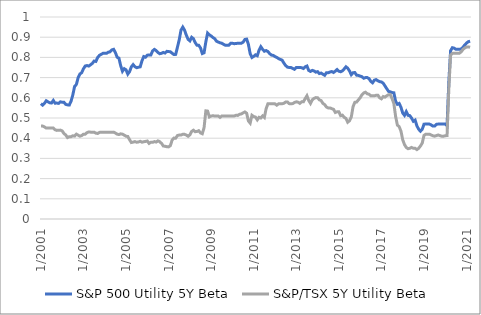
| Category | S&P 500 Utility 5Y Beta | S&P/TSX 5Y Utility Beta |
|---|---|---|
| 2001-01-31 | 0.571 | 0.46 |
| 2001-02-28 | 0.564 | 0.46 |
| 2001-03-31 | 0.572 | 0.456 |
| 2001-04-30 | 0.585 | 0.45 |
| 2001-05-31 | 0.58 | 0.45 |
| 2001-06-30 | 0.575 | 0.45 |
| 2001-07-31 | 0.574 | 0.45 |
| 2001-08-30 | 0.587 | 0.45 |
| 2001-09-30 | 0.573 | 0.442 |
| 2001-10-31 | 0.574 | 0.439 |
| 2001-11-30 | 0.572 | 0.44 |
| 2001-12-31 | 0.58 | 0.44 |
| 2002-01-31 | 0.578 | 0.436 |
| 2002-02-28 | 0.578 | 0.423 |
| 2002-03-31 | 0.568 | 0.416 |
| 2002-04-30 | 0.565 | 0.403 |
| 2002-05-31 | 0.564 | 0.408 |
| 2002-06-30 | 0.583 | 0.408 |
| 2002-07-31 | 0.614 | 0.412 |
| 2002-08-30 | 0.656 | 0.41 |
| 2002-09-30 | 0.666 | 0.42 |
| 2002-10-31 | 0.7 | 0.415 |
| 2002-11-30 | 0.718 | 0.41 |
| 2002-12-31 | 0.724 | 0.413 |
| 2003-01-31 | 0.744 | 0.42 |
| 2003-02-28 | 0.757 | 0.42 |
| 2003-03-31 | 0.76 | 0.428 |
| 2003-04-30 | 0.757 | 0.431 |
| 2003-05-31 | 0.763 | 0.43 |
| 2003-06-30 | 0.77 | 0.43 |
| 2003-07-31 | 0.782 | 0.43 |
| 2003-08-30 | 0.78 | 0.425 |
| 2003-09-30 | 0.8 | 0.423 |
| 2003-10-31 | 0.81 | 0.429 |
| 2003-11-30 | 0.815 | 0.43 |
| 2003-12-31 | 0.82 | 0.43 |
| 2004-01-31 | 0.82 | 0.43 |
| 2004-02-28 | 0.82 | 0.43 |
| 2004-03-31 | 0.826 | 0.43 |
| 2004-04-30 | 0.828 | 0.43 |
| 2004-05-31 | 0.837 | 0.429 |
| 2004-06-30 | 0.84 | 0.43 |
| 2004-07-31 | 0.824 | 0.426 |
| 2004-08-30 | 0.801 | 0.42 |
| 2004-09-30 | 0.796 | 0.418 |
| 2004-10-31 | 0.759 | 0.422 |
| 2004-11-30 | 0.731 | 0.42 |
| 2004-12-31 | 0.744 | 0.415 |
| 2005-01-31 | 0.739 | 0.41 |
| 2005-02-28 | 0.717 | 0.408 |
| 2005-03-31 | 0.73 | 0.393 |
| 2005-04-30 | 0.753 | 0.379 |
| 2005-05-31 | 0.764 | 0.38 |
| 2005-06-30 | 0.754 | 0.383 |
| 2005-07-31 | 0.749 | 0.38 |
| 2005-08-30 | 0.751 | 0.381 |
| 2005-09-30 | 0.753 | 0.385 |
| 2005-10-31 | 0.783 | 0.38 |
| 2005-11-30 | 0.804 | 0.382 |
| 2005-12-31 | 0.801 | 0.384 |
| 2006-01-31 | 0.811 | 0.386 |
| 2006-02-28 | 0.812 | 0.374 |
| 2006-03-31 | 0.812 | 0.38 |
| 2006-04-30 | 0.832 | 0.379 |
| 2006-05-31 | 0.84 | 0.383 |
| 2006-06-30 | 0.834 | 0.381 |
| 2006-07-31 | 0.825 | 0.387 |
| 2006-08-30 | 0.818 | 0.383 |
| 2006-09-30 | 0.82 | 0.375 |
| 2006-10-31 | 0.825 | 0.361 |
| 2006-11-30 | 0.821 | 0.36 |
| 2006-12-31 | 0.83 | 0.358 |
| 2007-01-31 | 0.829 | 0.357 |
| 2007-02-28 | 0.828 | 0.363 |
| 2007-03-31 | 0.821 | 0.391 |
| 2007-04-30 | 0.814 | 0.401 |
| 2007-05-31 | 0.815 | 0.4 |
| 2007-06-30 | 0.851 | 0.413 |
| 2007-07-31 | 0.887 | 0.416 |
| 2007-08-30 | 0.935 | 0.415 |
| 2007-09-30 | 0.95 | 0.419 |
| 2007-10-31 | 0.935 | 0.419 |
| 2007-11-30 | 0.91 | 0.416 |
| 2007-12-31 | 0.89 | 0.409 |
| 2008-01-31 | 0.882 | 0.417 |
| 2008-02-28 | 0.9 | 0.434 |
| 2008-03-31 | 0.893 | 0.44 |
| 2008-04-30 | 0.873 | 0.432 |
| 2008-05-31 | 0.86 | 0.433 |
| 2008-06-30 | 0.86 | 0.437 |
| 2008-07-31 | 0.847 | 0.426 |
| 2008-08-30 | 0.819 | 0.422 |
| 2008-09-30 | 0.823 | 0.452 |
| 2008-10-31 | 0.877 | 0.535 |
| 2008-11-30 | 0.921 | 0.534 |
| 2008-12-31 | 0.912 | 0.505 |
| 2009-01-31 | 0.906 | 0.51 |
| 2009-02-28 | 0.898 | 0.511 |
| 2009-03-31 | 0.893 | 0.51 |
| 2009-04-30 | 0.88 | 0.51 |
| 2009-05-31 | 0.876 | 0.51 |
| 2009-06-30 | 0.872 | 0.503 |
| 2009-07-31 | 0.87 | 0.51 |
| 2009-08-30 | 0.865 | 0.51 |
| 2009-09-30 | 0.86 | 0.51 |
| 2009-10-31 | 0.86 | 0.51 |
| 2009-11-30 | 0.86 | 0.51 |
| 2009-12-31 | 0.87 | 0.51 |
| 2010-01-31 | 0.87 | 0.51 |
| 2010-02-28 | 0.868 | 0.51 |
| 2010-03-31 | 0.869 | 0.513 |
| 2010-04-30 | 0.87 | 0.513 |
| 2010-05-31 | 0.87 | 0.518 |
| 2010-06-30 | 0.87 | 0.52 |
| 2010-07-31 | 0.875 | 0.525 |
| 2010-08-30 | 0.889 | 0.53 |
| 2010-09-30 | 0.89 | 0.524 |
| 2010-10-31 | 0.864 | 0.486 |
| 2010-11-30 | 0.819 | 0.475 |
| 2010-12-31 | 0.8 | 0.513 |
| 2011-01-31 | 0.805 | 0.507 |
| 2011-02-28 | 0.813 | 0.505 |
| 2011-03-31 | 0.808 | 0.491 |
| 2011-04-30 | 0.835 | 0.503 |
| 2011-05-31 | 0.853 | 0.5 |
| 2011-06-30 | 0.84 | 0.51 |
| 2011-07-31 | 0.83 | 0.503 |
| 2011-08-30 | 0.834 | 0.546 |
| 2011-09-30 | 0.829 | 0.57 |
| 2011-10-31 | 0.819 | 0.571 |
| 2011-11-30 | 0.811 | 0.57 |
| 2011-12-31 | 0.81 | 0.57 |
| 2012-01-31 | 0.804 | 0.57 |
| 2012-02-28 | 0.8 | 0.564 |
| 2012-03-31 | 0.794 | 0.57 |
| 2012-04-30 | 0.79 | 0.57 |
| 2012-05-31 | 0.786 | 0.57 |
| 2012-06-30 | 0.772 | 0.573 |
| 2012-07-31 | 0.76 | 0.579 |
| 2012-08-30 | 0.752 | 0.58 |
| 2012-09-30 | 0.75 | 0.571 |
| 2012-10-31 | 0.75 | 0.57 |
| 2012-11-30 | 0.745 | 0.571 |
| 2012-12-31 | 0.741 | 0.577 |
| 2013-01-31 | 0.75 | 0.58 |
| 2013-02-28 | 0.75 | 0.578 |
| 2013-03-31 | 0.75 | 0.573 |
| 2013-04-30 | 0.749 | 0.58 |
| 2013-05-31 | 0.745 | 0.58 |
| 2013-06-30 | 0.753 | 0.596 |
| 2013-07-31 | 0.757 | 0.61 |
| 2013-08-30 | 0.735 | 0.587 |
| 2013-09-30 | 0.731 | 0.573 |
| 2013-10-31 | 0.736 | 0.59 |
| 2013-11-30 | 0.733 | 0.597 |
| 2013-12-31 | 0.727 | 0.601 |
| 2014-01-31 | 0.73 | 0.6 |
| 2014-02-28 | 0.72 | 0.59 |
| 2014-03-31 | 0.722 | 0.586 |
| 2014-04-30 | 0.717 | 0.572 |
| 2014-05-31 | 0.711 | 0.567 |
| 2014-06-30 | 0.724 | 0.554 |
| 2014-07-31 | 0.724 | 0.55 |
| 2014-08-30 | 0.728 | 0.55 |
| 2014-09-30 | 0.73 | 0.546 |
| 2014-10-31 | 0.725 | 0.543 |
| 2014-11-30 | 0.732 | 0.527 |
| 2014-12-31 | 0.74 | 0.53 |
| 2015-01-31 | 0.732 | 0.53 |
| 2015-02-28 | 0.729 | 0.512 |
| 2015-03-31 | 0.733 | 0.514 |
| 2015-04-30 | 0.743 | 0.503 |
| 2015-05-31 | 0.754 | 0.498 |
| 2015-06-30 | 0.746 | 0.479 |
| 2015-07-31 | 0.733 | 0.486 |
| 2015-08-30 | 0.714 | 0.505 |
| 2015-09-30 | 0.724 | 0.556 |
| 2015-10-31 | 0.725 | 0.578 |
| 2015-11-30 | 0.712 | 0.579 |
| 2015-12-31 | 0.711 | 0.59 |
| 2016-01-31 | 0.707 | 0.6 |
| 2016-02-28 | 0.704 | 0.615 |
| 2016-03-31 | 0.697 | 0.624 |
| 2016-04-30 | 0.7 | 0.628 |
| 2016-05-31 | 0.7 | 0.62 |
| 2016-06-30 | 0.695 | 0.618 |
| 2016-07-31 | 0.681 | 0.61 |
| 2016-08-30 | 0.674 | 0.61 |
| 2016-09-30 | 0.687 | 0.61 |
| 2016-10-31 | 0.69 | 0.612 |
| 2016-11-30 | 0.684 | 0.613 |
| 2016-12-31 | 0.68 | 0.6 |
| 2017-01-31 | 0.678 | 0.595 |
| 2017-02-28 | 0.672 | 0.606 |
| 2017-03-31 | 0.659 | 0.603 |
| 2017-04-30 | 0.645 | 0.61 |
| 2017-05-31 | 0.632 | 0.615 |
| 2017-06-30 | 0.63 | 0.616 |
| 2017-07-31 | 0.626 | 0.596 |
| 2017-08-30 | 0.625 | 0.572 |
| 2017-09-30 | 0.583 | 0.508 |
| 2017-10-31 | 0.568 | 0.465 |
| 2017-11-30 | 0.572 | 0.457 |
| 2017-12-31 | 0.554 | 0.435 |
| 2018-01-31 | 0.525 | 0.392 |
| 2018-02-28 | 0.513 | 0.368 |
| 2018-03-31 | 0.531 | 0.354 |
| 2018-04-30 | 0.513 | 0.348 |
| 2018-05-31 | 0.512 | 0.35 |
| 2018-06-30 | 0.5 | 0.354 |
| 2018-07-31 | 0.484 | 0.35 |
| 2018-08-30 | 0.49 | 0.35 |
| 2018-09-30 | 0.461 | 0.344 |
| 2018-10-31 | 0.444 | 0.35 |
| 2018-11-30 | 0.435 | 0.361 |
| 2018-12-31 | 0.444 | 0.376 |
| 2019-01-31 | 0.47 | 0.414 |
| 2019-02-28 | 0.47 | 0.42 |
| 2019-03-31 | 0.47 | 0.42 |
| 2019-04-30 | 0.47 | 0.42 |
| 2019-05-31 | 0.466 | 0.416 |
| 2019-06-30 | 0.46 | 0.412 |
| 2019-07-31 | 0.46 | 0.41 |
| 2019-08-30 | 0.469 | 0.413 |
| 2019-09-30 | 0.47 | 0.416 |
| 2019-10-31 | 0.47 | 0.413 |
| 2019-11-30 | 0.47 | 0.41 |
| 2019-12-31 | 0.47 | 0.41 |
| 2020-01-31 | 0.47 | 0.412 |
| 2020-02-28 | 0.461 | 0.413 |
| 2020-03-31 | 0.679 | 0.645 |
| 2020-04-30 | 0.833 | 0.812 |
| 2020-05-31 | 0.848 | 0.82 |
| 2020-06-30 | 0.846 | 0.82 |
| 2020-07-31 | 0.84 | 0.82 |
| 2020-08-30 | 0.84 | 0.82 |
| 2020-09-30 | 0.84 | 0.821 |
| 2020-10-31 | 0.842 | 0.828 |
| 2020-11-30 | 0.85 | 0.84 |
| 2020-12-31 | 0.862 | 0.847 |
| 2021-01-31 | 0.871 | 0.852 |
| 2021-02-28 | 0.878 | 0.852 |
| 2021-03-31 | 0.88 | 0.85 |